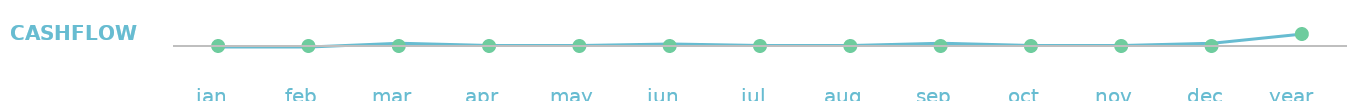
| Category | Cash Flow |
|---|---|
| jan  | -475 |
| feb  | -475 |
| mar  | 1275 |
| apr  | 275 |
| may  | 275 |
| jun  | 925 |
| jul  | 275 |
| aug  | 275 |
| sep  | 1275 |
| oct  | 275 |
| nov  | 275 |
| dec  | 1275 |
| year   | 5450 |